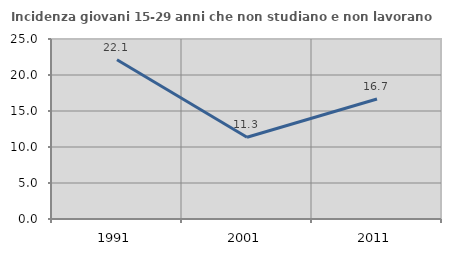
| Category | Incidenza giovani 15-29 anni che non studiano e non lavorano  |
|---|---|
| 1991.0 | 22.117 |
| 2001.0 | 11.347 |
| 2011.0 | 16.667 |